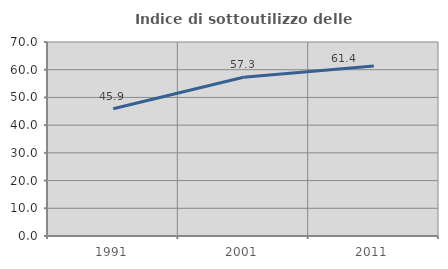
| Category | Indice di sottoutilizzo delle abitazioni  |
|---|---|
| 1991.0 | 45.93 |
| 2001.0 | 57.31 |
| 2011.0 | 61.364 |